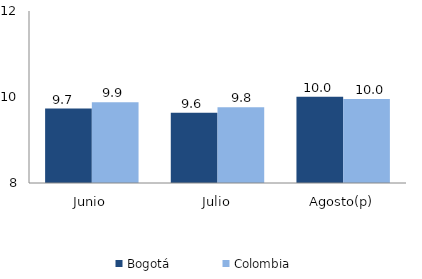
| Category | Bogotá | Colombia |
|---|---|---|
| Junio | 9.732 | 9.879 |
| Julio | 9.636 | 9.764 |
| Agosto(p) | 10.008 | 9.951 |